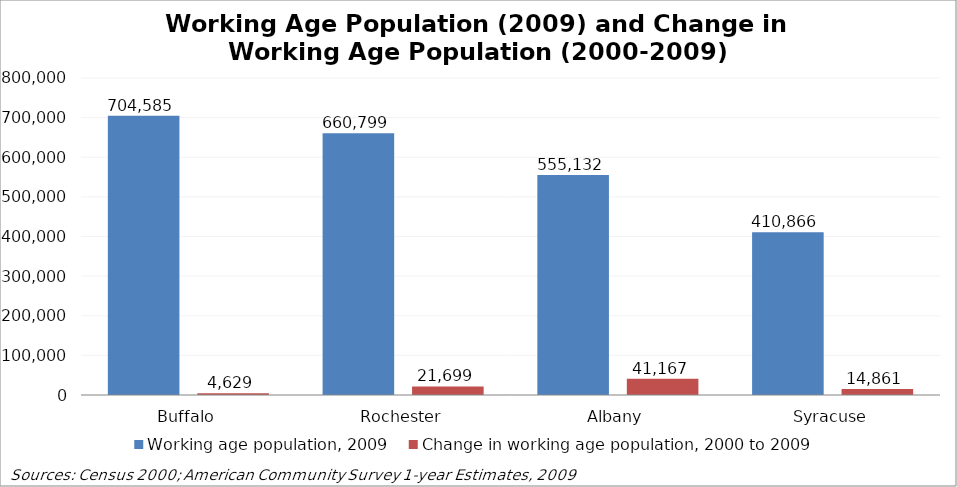
| Category | Working age population, 2009 | Change in working age population, 2000 to 2009 |
|---|---|---|
| Buffalo | 704585 | 4629 |
| Rochester | 660799 | 21699 |
| Albany | 555132 | 41167 |
| Syracuse | 410866 | 14861 |